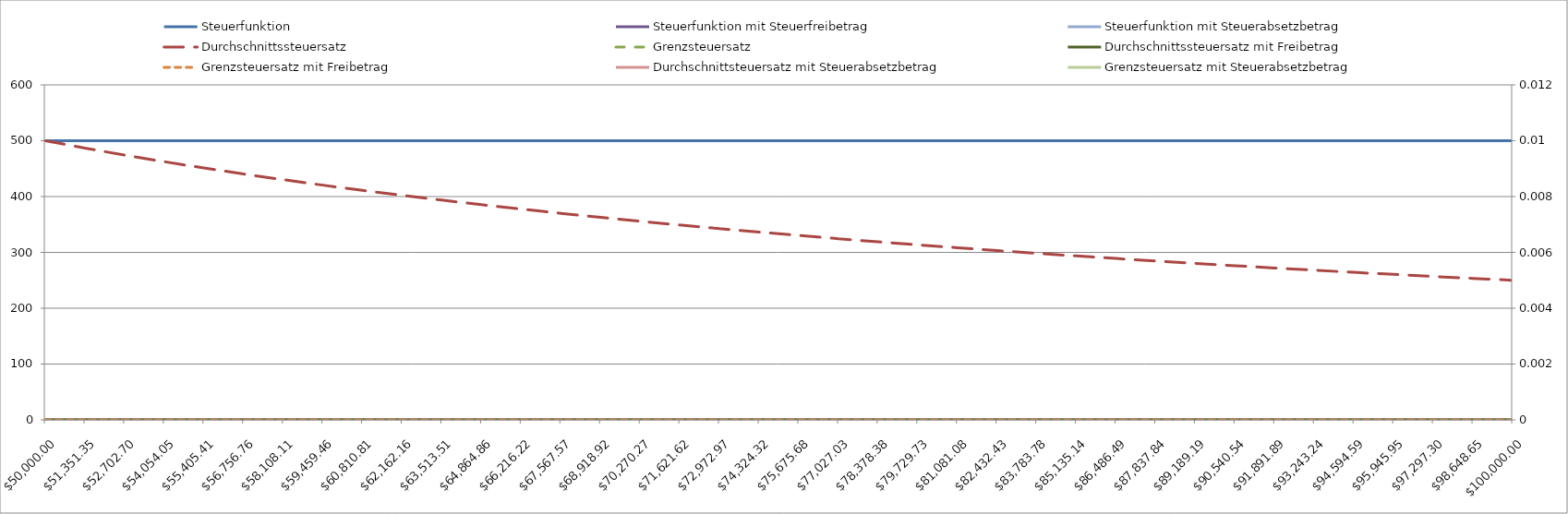
| Category | Steuerfunktion | Steuerfunktion mit Steuerfreibetrag | Steuerfunktion mit Steuerabsetzbetrag |
|---|---|---|---|
| 50000.0 | 500 | 0 |  |
| 51351.35135135135 | 500 | 0 |  |
| 52702.70270270271 | 500 | 0 |  |
| 54054.05405405406 | 500 | 0 |  |
| 55405.405405405414 | 500 | 0 |  |
| 56756.75675675677 | 500 | 0 |  |
| 58108.10810810812 | 500 | 0 |  |
| 59459.459459459475 | 500 | 0 |  |
| 60810.81081081083 | 500 | 0 |  |
| 62162.16216216218 | 500 | 0 |  |
| 63513.513513513535 | 500 | 0 |  |
| 64864.86486486489 | 500 | 0 |  |
| 66216.21621621624 | 500 | 0 |  |
| 67567.56756756759 | 500 | 0 |  |
| 68918.91891891893 | 500 | 0 |  |
| 70270.27027027028 | 500 | 0 |  |
| 71621.62162162163 | 500 | 0 |  |
| 72972.97297297297 | 500 | 0 |  |
| 74324.32432432432 | 500 | 0 |  |
| 75675.67567567567 | 500 | 0 |  |
| 77027.02702702701 | 500 | 0 |  |
| 78378.37837837836 | 500 | 0 |  |
| 79729.7297297297 | 500 | 0 |  |
| 81081.08108108105 | 500 | 0 |  |
| 82432.4324324324 | 500 | 0 |  |
| 83783.78378378374 | 500 | 0 |  |
| 85135.13513513509 | 500 | 0 |  |
| 86486.48648648644 | 500 | 0 |  |
| 87837.83783783778 | 500 | 0 |  |
| 89189.18918918913 | 500 | 0 |  |
| 90540.54054054047 | 500 | 0 |  |
| 91891.89189189182 | 500 | 0 |  |
| 93243.24324324317 | 500 | 0 |  |
| 94594.59459459451 | 500 | 0 |  |
| 95945.94594594586 | 500 | 0 |  |
| 97297.2972972972 | 500 | 0 |  |
| 98648.64864864855 | 500 | 0 |  |
| 99999.9999999999 | 500 | 0 |  |